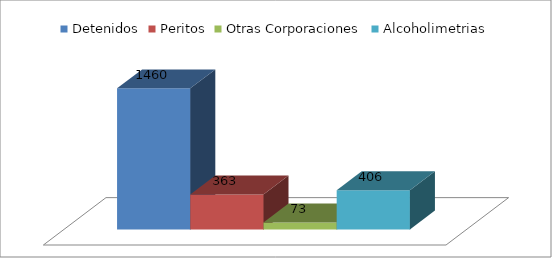
| Category | Detenidos | Peritos | Otras Corporaciones | Alcoholimetrias |
|---|---|---|---|---|
| 0 | 1460 | 363 | 73 | 406 |